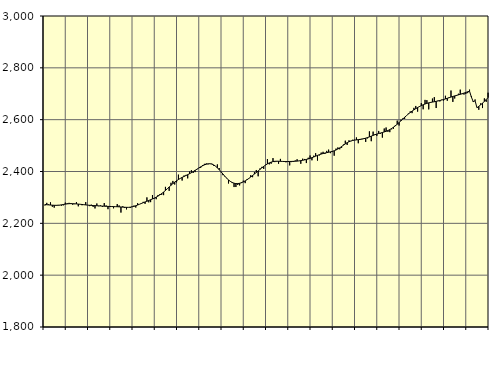
| Category | Piggar | Series 1 |
|---|---|---|
| nan | 2268.7 | 2272.54 |
| 1.0 | 2279 | 2271.78 |
| 1.0 | 2273.5 | 2271.15 |
| 1.0 | 2281 | 2270.57 |
| 1.0 | 2264 | 2270.02 |
| 1.0 | 2260.6 | 2269.6 |
| 1.0 | 2268.4 | 2269.51 |
| 1.0 | 2271 | 2269.7 |
| 1.0 | 2269.4 | 2270.38 |
| 1.0 | 2268.1 | 2271.44 |
| 1.0 | 2269.5 | 2272.73 |
| 1.0 | 2279.8 | 2274.01 |
| nan | 2277.8 | 2275.05 |
| 2.0 | 2279 | 2275.75 |
| 2.0 | 2278.4 | 2276 |
| 2.0 | 2271.7 | 2275.85 |
| 2.0 | 2274.1 | 2275.47 |
| 2.0 | 2281.9 | 2274.93 |
| 2.0 | 2265.6 | 2274.28 |
| 2.0 | 2273.3 | 2273.53 |
| 2.0 | 2269.8 | 2272.74 |
| 2.0 | 2271.6 | 2271.92 |
| 2.0 | 2281.9 | 2271.09 |
| 2.0 | 2270.6 | 2270.33 |
| nan | 2266.4 | 2269.64 |
| 3.0 | 2272.1 | 2269.05 |
| 3.0 | 2263.6 | 2268.6 |
| 3.0 | 2257.5 | 2268.25 |
| 3.0 | 2276.5 | 2267.9 |
| 3.0 | 2266.1 | 2267.48 |
| 3.0 | 2269.2 | 2267 |
| 3.0 | 2263.5 | 2266.52 |
| 3.0 | 2278.2 | 2266.05 |
| 3.0 | 2268.9 | 2265.66 |
| 3.0 | 2254.6 | 2265.32 |
| 3.0 | 2263 | 2265.02 |
| nan | 2263.6 | 2264.79 |
| 4.0 | 2258 | 2264.57 |
| 4.0 | 2263.8 | 2264.34 |
| 4.0 | 2274.2 | 2264.06 |
| 4.0 | 2269 | 2263.67 |
| 4.0 | 2241.5 | 2263.13 |
| 4.0 | 2266 | 2262.54 |
| 4.0 | 2259 | 2262.04 |
| 4.0 | 2253.9 | 2261.7 |
| 4.0 | 2261.2 | 2261.69 |
| 4.0 | 2259.3 | 2262.3 |
| 4.0 | 2265.3 | 2263.55 |
| nan | 2268.4 | 2265.41 |
| 5.0 | 2261 | 2267.84 |
| 5.0 | 2277.7 | 2270.65 |
| 5.0 | 2273.3 | 2273.62 |
| 5.0 | 2277.8 | 2276.58 |
| 5.0 | 2282.9 | 2279.56 |
| 5.0 | 2275.3 | 2282.45 |
| 5.0 | 2300.1 | 2285.24 |
| 5.0 | 2281 | 2288.11 |
| 5.0 | 2281.8 | 2291.06 |
| 5.0 | 2309.1 | 2294.1 |
| 5.0 | 2295.4 | 2297.39 |
| nan | 2293.1 | 2301.07 |
| 6.0 | 2309.4 | 2305.17 |
| 6.0 | 2312.9 | 2309.77 |
| 6.0 | 2310 | 2314.94 |
| 6.0 | 2308.8 | 2320.69 |
| 6.0 | 2340.7 | 2326.92 |
| 6.0 | 2333.2 | 2333.53 |
| 6.0 | 2325.4 | 2340.28 |
| 6.0 | 2356.5 | 2346.84 |
| 6.0 | 2363.6 | 2353.11 |
| 6.0 | 2349.7 | 2358.94 |
| 6.0 | 2358.2 | 2364.21 |
| nan | 2387.9 | 2368.99 |
| 7.0 | 2373.7 | 2373.31 |
| 7.0 | 2365.1 | 2377.2 |
| 7.0 | 2384.3 | 2380.8 |
| 7.0 | 2386.8 | 2384.3 |
| 7.0 | 2373.5 | 2387.82 |
| 7.0 | 2399.7 | 2391.49 |
| 7.0 | 2405.1 | 2395.47 |
| 7.0 | 2394.7 | 2399.8 |
| 7.0 | 2397.6 | 2404.35 |
| 7.0 | 2407.9 | 2409 |
| 7.0 | 2413.2 | 2413.63 |
| nan | 2413.9 | 2418.02 |
| 8.0 | 2425 | 2421.99 |
| 8.0 | 2429.5 | 2425.43 |
| 8.0 | 2431.2 | 2428.1 |
| 8.0 | 2427.6 | 2429.7 |
| 8.0 | 2429.2 | 2429.96 |
| 8.0 | 2430.1 | 2428.63 |
| 8.0 | 2422.3 | 2425.5 |
| 8.0 | 2421.1 | 2420.62 |
| 8.0 | 2427.3 | 2414.31 |
| 8.0 | 2413.2 | 2406.92 |
| 8.0 | 2396.6 | 2398.81 |
| nan | 2385.9 | 2390.39 |
| 9.0 | 2380.7 | 2382.12 |
| 9.0 | 2373.2 | 2374.38 |
| 9.0 | 2353.8 | 2367.55 |
| 9.0 | 2360.8 | 2361.89 |
| 9.0 | 2355.4 | 2357.64 |
| 9.0 | 2340 | 2354.82 |
| 9.0 | 2340.1 | 2353.39 |
| 9.0 | 2348 | 2353.35 |
| 9.0 | 2346.3 | 2354.52 |
| 9.0 | 2359.1 | 2356.71 |
| 9.0 | 2364.5 | 2359.84 |
| nan | 2355.1 | 2363.81 |
| 10.0 | 2370.4 | 2368.35 |
| 10.0 | 2373.9 | 2373.35 |
| 10.0 | 2385.7 | 2378.78 |
| 10.0 | 2378 | 2384.47 |
| 10.0 | 2397.6 | 2390.29 |
| 10.0 | 2405.8 | 2396.22 |
| 10.0 | 2381.5 | 2402.22 |
| 10.0 | 2411.8 | 2408.21 |
| 10.0 | 2417.8 | 2414.11 |
| 10.0 | 2409.7 | 2419.73 |
| 10.0 | 2425.8 | 2424.89 |
| nan | 2447.9 | 2429.45 |
| 11.0 | 2427.5 | 2433.25 |
| 11.0 | 2430 | 2436.16 |
| 11.0 | 2451.7 | 2438.17 |
| 11.0 | 2436.3 | 2439.32 |
| 11.0 | 2438.2 | 2439.72 |
| 11.0 | 2429.8 | 2439.56 |
| 11.0 | 2448.6 | 2439.19 |
| 11.0 | 2438.3 | 2438.85 |
| 11.0 | 2436.6 | 2438.54 |
| 11.0 | 2435.5 | 2438.44 |
| 11.0 | 2437.9 | 2438.53 |
| nan | 2423.6 | 2438.66 |
| 12.0 | 2436.3 | 2438.86 |
| 12.0 | 2436.6 | 2439.18 |
| 12.0 | 2442.6 | 2439.55 |
| 12.0 | 2447.1 | 2440.07 |
| 12.0 | 2441.1 | 2440.89 |
| 12.0 | 2429.9 | 2441.98 |
| 12.0 | 2449.4 | 2443.28 |
| 12.0 | 2448.3 | 2444.78 |
| 12.0 | 2432.6 | 2446.52 |
| 12.0 | 2453 | 2448.49 |
| 12.0 | 2461.9 | 2450.74 |
| nan | 2443.2 | 2453.26 |
| 13.0 | 2461.1 | 2456.11 |
| 13.0 | 2470.6 | 2459.13 |
| 13.0 | 2442.1 | 2462.08 |
| 13.0 | 2461.9 | 2464.82 |
| 13.0 | 2472.9 | 2467.27 |
| 13.0 | 2476 | 2469.42 |
| 13.0 | 2467.6 | 2471.21 |
| 13.0 | 2479.6 | 2472.73 |
| 13.0 | 2484.4 | 2474.17 |
| 13.0 | 2470.9 | 2475.75 |
| 13.0 | 2475 | 2477.61 |
| nan | 2461 | 2479.96 |
| 14.0 | 2488.3 | 2482.96 |
| 14.0 | 2492.8 | 2486.72 |
| 14.0 | 2485.7 | 2491.22 |
| 14.0 | 2491.1 | 2496.3 |
| 14.0 | 2504 | 2501.53 |
| 14.0 | 2518.9 | 2506.59 |
| 14.0 | 2502.5 | 2511.18 |
| 14.0 | 2520.3 | 2514.94 |
| 14.0 | 2516.8 | 2517.8 |
| 14.0 | 2522.6 | 2519.79 |
| 14.0 | 2522.7 | 2521.12 |
| nan | 2531.4 | 2522.08 |
| 15.0 | 2509 | 2522.88 |
| 15.0 | 2525.7 | 2523.71 |
| 15.0 | 2526.4 | 2524.93 |
| 15.0 | 2528.4 | 2526.62 |
| 15.0 | 2514.1 | 2528.66 |
| 15.0 | 2527.8 | 2530.99 |
| 15.0 | 2554.8 | 2533.6 |
| 15.0 | 2516.9 | 2536.43 |
| 15.0 | 2553.9 | 2539.3 |
| 15.0 | 2544 | 2542.04 |
| 15.0 | 2537.4 | 2544.45 |
| nan | 2556.5 | 2546.57 |
| 16.0 | 2546 | 2548.52 |
| 16.0 | 2530.8 | 2550.47 |
| 16.0 | 2565.9 | 2552.59 |
| 16.0 | 2569.8 | 2555.09 |
| 16.0 | 2553.1 | 2558.13 |
| 16.0 | 2551.8 | 2561.81 |
| 16.0 | 2562.7 | 2566.11 |
| 16.0 | 2565.1 | 2571 |
| 16.0 | 2579.2 | 2576.46 |
| 16.0 | 2596.2 | 2582.41 |
| 16.0 | 2577.4 | 2588.82 |
| nan | 2599.6 | 2595.51 |
| 17.0 | 2604.7 | 2602.36 |
| 17.0 | 2603 | 2609.16 |
| 17.0 | 2616.1 | 2615.63 |
| 17.0 | 2623.7 | 2621.71 |
| 17.0 | 2631.7 | 2627.44 |
| 17.0 | 2625.2 | 2632.85 |
| 17.0 | 2645.6 | 2637.81 |
| 17.0 | 2652.9 | 2642.44 |
| 17.0 | 2631 | 2646.75 |
| 17.0 | 2649.1 | 2650.71 |
| 17.0 | 2663.8 | 2654.3 |
| nan | 2640.1 | 2657.58 |
| 18.0 | 2676.3 | 2660.4 |
| 18.0 | 2675.4 | 2662.83 |
| 18.0 | 2639.7 | 2664.9 |
| 18.0 | 2668.2 | 2666.51 |
| 18.0 | 2681.4 | 2667.89 |
| 18.0 | 2686.9 | 2669.24 |
| 18.0 | 2644.9 | 2670.7 |
| 18.0 | 2673.5 | 2672.26 |
| 18.0 | 2670.3 | 2673.92 |
| 18.0 | 2677.2 | 2675.78 |
| 18.0 | 2673.7 | 2677.8 |
| nan | 2692.2 | 2680.03 |
| 19.0 | 2673 | 2682.44 |
| 19.0 | 2686.8 | 2684.86 |
| 19.0 | 2712.4 | 2687.26 |
| 19.0 | 2668.6 | 2689.61 |
| 19.0 | 2681.7 | 2691.72 |
| 19.0 | 2691.6 | 2693.64 |
| 19.0 | 2700.1 | 2695.63 |
| 19.0 | 2715.8 | 2697.81 |
| 19.0 | 2698.5 | 2700.16 |
| 19.0 | 2696.8 | 2702.59 |
| 19.0 | 2699 | 2705.07 |
| nan | 2702.4 | 2707.51 |
| 20.0 | 2715.9 | 2709.91 |
| 20.0 | 2690.1 | 2687.39 |
| 20.0 | 2672 | 2669.29 |
| 20.0 | 2677.9 | 2672.92 |
| 20.0 | 2645.5 | 2646 |
| 20.0 | 2638.1 | 2651.34 |
| 20.0 | 2662.9 | 2657.32 |
| 20.0 | 2644.8 | 2663.8 |
| 20.0 | 2682.2 | 2670.63 |
| 20.0 | 2668.8 | 2677.74 |
| 20.0 | 2704 | 2684.93 |